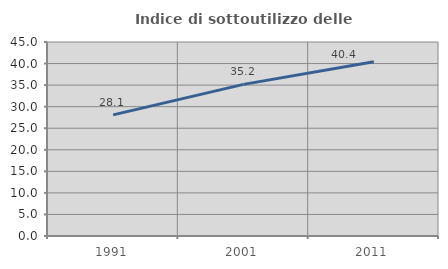
| Category | Indice di sottoutilizzo delle abitazioni  |
|---|---|
| 1991.0 | 28.097 |
| 2001.0 | 35.174 |
| 2011.0 | 40.399 |